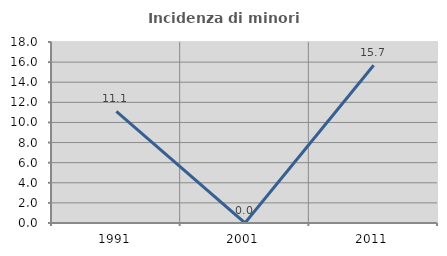
| Category | Incidenza di minori stranieri |
|---|---|
| 1991.0 | 11.111 |
| 2001.0 | 0 |
| 2011.0 | 15.686 |